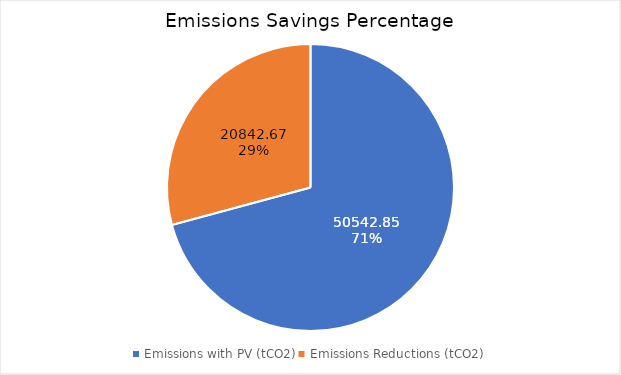
| Category | Emissions Savings Percentage |
|---|---|
| Emissions with PV (tCO2) | 50542.854 |
| Emissions Reductions (tCO2) | 20842.666 |